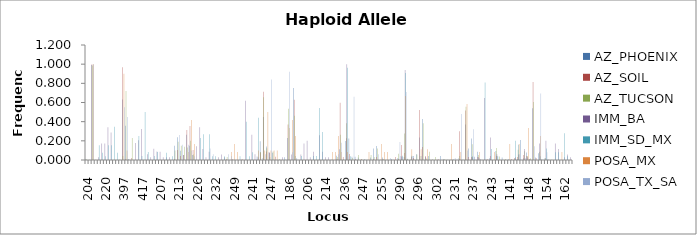
| Category | AZ_PHOENIX | AZ_SOIL | AZ_TUCSON | IMM_BA | IMM_SD_MX | POSA_MX | POSA_TX_SA |
|---|---|---|---|---|---|---|---|
| 204 | 0.009 | 0 | 0.007 | 0 | 0 | 0 | 0 |
| 205 | 0 | 0 | 0.004 | 0 | 0 | 0 | 0 |
| 206 | 0.991 | 1 | 0.986 | 0 | 0 | 1 | 1 |
| 209 | 0 | 0 | 0.004 | 0 | 0 | 0 | 0 |
| 216 | 0 | 0 | 0 | 0.029 | 0.154 | 0 | 0 |
| 218 | 0 | 0 | 0 | 0.171 | 0.077 | 0 | 0 |
| 220 | 0 | 0 | 0 | 0.171 | 0.038 | 0 | 0 |
| 222 | 0 | 0 | 0 | 0.343 | 0.154 | 0 | 0 |
| 224 | 0 | 0 | 0 | 0.286 | 0.154 | 0 | 0 |
| 226 | 0 | 0 | 0 | 0 | 0.346 | 0 | 0 |
| 228 | 0 | 0 | 0 | 0 | 0.077 | 0 | 0 |
| 393 | 0 | 0 | 0.004 | 0 | 0 | 0 | 0 |
| 397 | 0.632 | 0.969 | 0.043 | 0 | 0 | 0.9 | 0.551 |
| 398 | 0.358 | 0.01 | 0.72 | 0 | 0 | 0.1 | 0.449 |
| 399 | 0.009 | 0 | 0.004 | 0 | 0 | 0 | 0 |
| 400 | 0 | 0.021 | 0.23 | 0 | 0 | 0 | 0 |
| 413 | 0 | 0 | 0 | 0.176 | 0 | 0 | 0 |
| 415 | 0 | 0 | 0 | 0.206 | 0.25 | 0 | 0 |
| 417 | 0 | 0 | 0 | 0.324 | 0.042 | 0 | 0 |
| 418 | 0 | 0 | 0 | 0 | 0.5 | 0 | 0 |
| 419 | 0 | 0 | 0 | 0.059 | 0.083 | 0 | 0 |
| 421 | 0 | 0 | 0 | 0.029 | 0 | 0 | 0 |
| 423 | 0 | 0 | 0 | 0.118 | 0.042 | 0 | 0 |
| 425 | 0 | 0 | 0 | 0.088 | 0.083 | 0 | 0 |
| 207 | 0 | 0 | 0 | 0.086 | 0 | 0 | 0 |
| 208 | 0 | 0 | 0 | 0.029 | 0 | 0 | 0 |
| 209 | 0 | 0 | 0 | 0.029 | 0.077 | 0 | 0 |
| 210 | 0 | 0 | 0 | 0.029 | 0 | 0 | 0 |
| 211 | 0 | 0 | 0 | 0 | 0.038 | 0 | 0 |
| 212 | 0.149 | 0.01 | 0.099 | 0 | 0 | 0 | 0 |
| 213 | 0.237 | 0.104 | 0.191 | 0 | 0 | 0 | 0.26 |
| 214 | 0.096 | 0.042 | 0.149 | 0 | 0 | 0 | 0.16 |
| 215 | 0.053 | 0.052 | 0.138 | 0 | 0 | 0 | 0 |
| 216 | 0.263 | 0.312 | 0.131 | 0 | 0 | 0.083 | 0.16 |
| 217 | 0.149 | 0.354 | 0.202 | 0 | 0 | 0.417 | 0.1 |
| 218 | 0.053 | 0.104 | 0.057 | 0 | 0 | 0.167 | 0.04 |
| 226 | 0 | 0 | 0 | 0.143 | 0 | 0 | 0 |
| 227 | 0 | 0 | 0 | 0.343 | 0.231 | 0 | 0 |
| 228 | 0 | 0 | 0 | 0.114 | 0.269 | 0 | 0 |
| 229 | 0 | 0 | 0 | 0.029 | 0 | 0 | 0 |
| 230 | 0 | 0 | 0 | 0.086 | 0.269 | 0 | 0.12 |
| 231 | 0 | 0 | 0 | 0 | 0.038 | 0 | 0.06 |
| 232 | 0 | 0 | 0 | 0 | 0.038 | 0 | 0 |
| 234 | 0 | 0 | 0 | 0.029 | 0 | 0 | 0 |
| 239 | 0 | 0 | 0 | 0.057 | 0 | 0 | 0 |
| 240 | 0 | 0 | 0 | 0.029 | 0.038 | 0 | 0 |
| 247 | 0 | 0.01 | 0.032 | 0 | 0 | 0 | 0.06 |
| 248 | 0 | 0 | 0 | 0 | 0 | 0.083 | 0.04 |
| 249 | 0 | 0.01 | 0 | 0 | 0 | 0.167 | 0 |
| 250 | 0 | 0 | 0 | 0 | 0 | 0.083 | 0 |
| 221 | 0 | 0 | 0 | 0 | 0.04 | 0 | 0 |
| 238 | 0 | 0.011 | 0 | 0 | 0 | 0 | 0 |
| 239 | 0 | 0 | 0 | 0.618 | 0.4 | 0 | 0 |
| 240 | 0 | 0 | 0 | 0 | 0.04 | 0 | 0 |
| 241 | 0 | 0 | 0 | 0.265 | 0.08 | 0 | 0 |
| 242 | 0 | 0 | 0 | 0.059 | 0 | 0 | 0 |
| 243 | 0.037 | 0 | 0.004 | 0.029 | 0.44 | 0.1 | 0 |
| 244 | 0.196 | 0.078 | 0.083 | 0 | 0 | 0 | 0.02 |
| 245 | 0.449 | 0.711 | 0.655 | 0 | 0 | 0.1 | 0.06 |
| 246 | 0.14 | 0.089 | 0.122 | 0 | 0 | 0.5 | 0.08 |
| 247 | 0.075 | 0.078 | 0.032 | 0 | 0 | 0.1 | 0.84 |
| 248 | 0.075 | 0 | 0.09 | 0 | 0 | 0.1 | 0 |
| 249 | 0 | 0.033 | 0 | 0 | 0 | 0.1 | 0 |
| 250 | 0 | 0 | 0.011 | 0 | 0 | 0 | 0 |
| 251 | 0 | 0 | 0 | 0.029 | 0 | 0 | 0 |
| 253 | 0.028 | 0 | 0.004 | 0 | 0 | 0 | 0 |
| 186 | 0.23 | 0.371 | 0.535 | 0 | 0 | 0.333 | 0.92 |
| 187 | 0 | 0 | 0 | 0.057 | 0 | 0.417 | 0.08 |
| 188 | 0.752 | 0.629 | 0.461 | 0 | 0.042 | 0.25 | 0 |
| 190 | 0.018 | 0 | 0 | 0 | 0 | 0 | 0 |
| 202 | 0 | 0 | 0 | 0.057 | 0.042 | 0 | 0 |
| 204 | 0 | 0 | 0 | 0.171 | 0 | 0 | 0 |
| 206 | 0 | 0 | 0 | 0.2 | 0 | 0 | 0 |
| 207 | 0 | 0 | 0 | 0.029 | 0 | 0 | 0 |
| 208 | 0 | 0 | 0 | 0.086 | 0.042 | 0 | 0 |
| 209 | 0 | 0 | 0 | 0 | 0.042 | 0 | 0 |
| 210 | 0 | 0 | 0.004 | 0.257 | 0.542 | 0 | 0 |
| 212 | 0 | 0 | 0 | 0.086 | 0.292 | 0 | 0 |
| 214 | 0 | 0 | 0 | 0.029 | 0 | 0 | 0 |
| 227 | 0 | 0 | 0 | 0.029 | 0 | 0 | 0 |
| 218 | 0 | 0 | 0.004 | 0 | 0 | 0.083 | 0 |
| 224 | 0 | 0 | 0 | 0 | 0 | 0.083 | 0 |
| 227 | 0.043 | 0.01 | 0.032 | 0 | 0 | 0.25 | 0.06 |
| 235 | 0.112 | 0.598 | 0.262 | 0 | 0 | 0.083 | 0.18 |
| 236 | 0 | 0.031 | 0.007 | 0 | 0 | 0 | 0 |
| 237 | 0.198 | 0.227 | 0.383 | 1 | 0.962 | 0.083 | 0.04 |
| 238 | 0.224 | 0.062 | 0.007 | 0 | 0.038 | 0 | 0 |
| 239 | 0.034 | 0 | 0.021 | 0 | 0 | 0 | 0.66 |
| 240 | 0.034 | 0.01 | 0 | 0 | 0 | 0 | 0 |
| 241 | 0.026 | 0 | 0.053 | 0 | 0 | 0 | 0 |
| 247 | 0 | 0.01 | 0.007 | 0 | 0 | 0 | 0 |
| 249 | 0.009 | 0 | 0.004 | 0 | 0 | 0 | 0 |
| 250 | 0 | 0 | 0.004 | 0 | 0 | 0.083 | 0 |
| 251 | 0.026 | 0 | 0.053 | 0 | 0 | 0 | 0 |
| 252 | 0.121 | 0.01 | 0.032 | 0 | 0 | 0 | 0 |
| 254 | 0.147 | 0.031 | 0.121 | 0 | 0 | 0 | 0.06 |
| 255 | 0 | 0 | 0.004 | 0 | 0 | 0.167 | 0 |
| 256 | 0.026 | 0.01 | 0.007 | 0 | 0 | 0.083 | 0 |
| 257 | 0 | 0 | 0 | 0 | 0 | 0.083 | 0 |
| 260 | 0 | 0 | 0 | 0 | 0 | 0 | 0.021 |
| 285 | 0.01 | 0 | 0 | 0 | 0 | 0 | 0 |
| 289 | 0 | 0.031 | 0 | 0 | 0 | 0 | 0 |
| 290 | 0.02 | 0.01 | 0.065 | 0 | 0 | 0 | 0.188 |
| 291 | 0.041 | 0.156 | 0.004 | 0.03 | 0.045 | 0 | 0 |
| 292 | 0.031 | 0.073 | 0.275 | 0.939 | 0.909 | 0.667 | 0.708 |
| 293 | 0.01 | 0 | 0.012 | 0 | 0 | 0 | 0 |
| 294 | 0 | 0 | 0.004 | 0.03 | 0.045 | 0.111 | 0.042 |
| 295 | 0.041 | 0.021 | 0.008 | 0 | 0 | 0 | 0 |
| 296 | 0.061 | 0 | 0.057 | 0 | 0 | 0 | 0 |
| 297 | 0.235 | 0.521 | 0.04 | 0 | 0 | 0.111 | 0.042 |
| 298 | 0.429 | 0.135 | 0.385 | 0 | 0 | 0 | 0 |
| 299 | 0.031 | 0.042 | 0.016 | 0 | 0 | 0.111 | 0 |
| 300 | 0.041 | 0 | 0.085 | 0 | 0 | 0 | 0 |
| 301 | 0 | 0 | 0.008 | 0 | 0 | 0 | 0 |
| 302 | 0 | 0 | 0.032 | 0 | 0 | 0 | 0 |
| 304 | 0 | 0.01 | 0 | 0 | 0 | 0 | 0 |
| 305 | 0.041 | 0 | 0 | 0 | 0 | 0 | 0 |
| 306 | 0.01 | 0 | 0.008 | 0 | 0 | 0 | 0 |
| 221 | 0 | 0 | 0.004 | 0 | 0 | 0 | 0 |
| 227 | 0 | 0 | 0.004 | 0 | 0 | 0.167 | 0 |
| 231 | 0.009 | 0 | 0 | 0 | 0 | 0 | 0.02 |
| 232 | 0 | 0 | 0 | 0 | 0 | 0 | 0.02 |
| 233 | 0.009 | 0.299 | 0.043 | 0 | 0 | 0.083 | 0.48 |
| 234 | 0 | 0 | 0.004 | 0 | 0 | 0 | 0 |
| 235 | 0.371 | 0.515 | 0.557 | 0 | 0 | 0.583 | 0.1 |
| 236 | 0.121 | 0.031 | 0 | 0 | 0 | 0 | 0 |
| 237 | 0.224 | 0.031 | 0.163 | 0.029 | 0.038 | 0 | 0.32 |
| 238 | 0.034 | 0 | 0 | 0 | 0 | 0 | 0 |
| 239 | 0.086 | 0.031 | 0.053 | 0.029 | 0 | 0.083 | 0.02 |
| 240 | 0.009 | 0 | 0 | 0 | 0 | 0 | 0 |
| 241 | 0 | 0 | 0.004 | 0.647 | 0.808 | 0 | 0 |
| 242 | 0 | 0.01 | 0 | 0 | 0 | 0 | 0 |
| 243 | 0.017 | 0.041 | 0.011 | 0.235 | 0.115 | 0 | 0 |
| 244 | 0 | 0 | 0 | 0 | 0 | 0.083 | 0 |
| 245 | 0.095 | 0.041 | 0.124 | 0.059 | 0.038 | 0 | 0.04 |
| 247 | 0 | 0 | 0.035 | 0 | 0 | 0 | 0 |
| 249 | 0.026 | 0 | 0 | 0 | 0 | 0 | 0 |
| 140 | 0 | 0 | 0.011 | 0 | 0 | 0 | 0 |
| 141 | 0.009 | 0 | 0 | 0 | 0 | 0.167 | 0 |
| 142 | 0 | 0.01 | 0 | 0 | 0 | 0 | 0 |
| 143 | 0 | 0.021 | 0.014 | 0.029 | 0.2 | 0 | 0 |
| 145 | 0.009 | 0.031 | 0.106 | 0.057 | 0.16 | 0.167 | 0.061 |
| 146 | 0.209 | 0 | 0 | 0 | 0 | 0 | 0 |
| 147 | 0.017 | 0.052 | 0.092 | 0.114 | 0 | 0 | 0.02 |
| 148 | 0.078 | 0.041 | 0.043 | 0.029 | 0 | 0.333 | 0 |
| 149 | 0.009 | 0.01 | 0.018 | 0 | 0 | 0 | 0 |
| 150 | 0.539 | 0.814 | 0.606 | 0 | 0 | 0 | 0.143 |
| 151 | 0.026 | 0.021 | 0 | 0 | 0 | 0 | 0 |
| 152 | 0.07 | 0 | 0.085 | 0.171 | 0.04 | 0.25 | 0.694 |
| 153 | 0.009 | 0 | 0 | 0 | 0 | 0 | 0 |
| 154 | 0.017 | 0 | 0.021 | 0.2 | 0.12 | 0 | 0.082 |
| 155 | 0.009 | 0 | 0 | 0 | 0 | 0 | 0 |
| 156 | 0 | 0 | 0.004 | 0 | 0 | 0 | 0 |
| 158 | 0 | 0 | 0 | 0.171 | 0.08 | 0 | 0 |
| 160 | 0 | 0 | 0 | 0.114 | 0.08 | 0 | 0 |
| 161 | 0 | 0 | 0 | 0 | 0 | 0.083 | 0 |
| 162 | 0 | 0 | 0 | 0.029 | 0.28 | 0 | 0 |
| 164 | 0 | 0 | 0 | 0.057 | 0.04 | 0 | 0 |
| 166 | 0 | 0 | 0 | 0.029 | 0 | 0 | 0 |